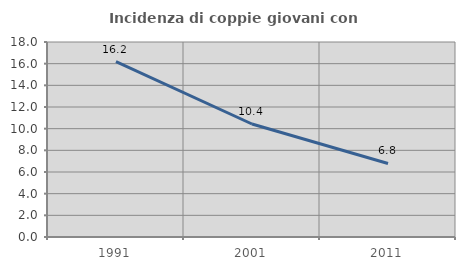
| Category | Incidenza di coppie giovani con figli |
|---|---|
| 1991.0 | 16.182 |
| 2001.0 | 10.43 |
| 2011.0 | 6.785 |